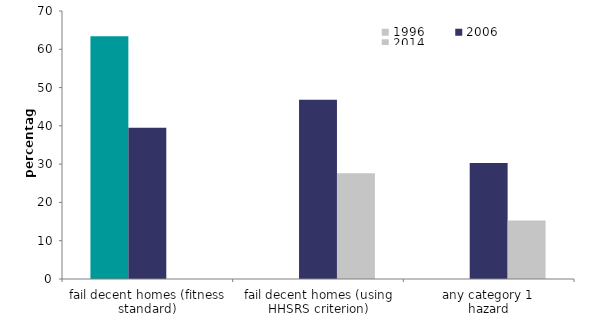
| Category | 1996 | 2006 | 2014 |
|---|---|---|---|
| fail decent homes (fitness standard) | 63.397 | 39.511 | 0 |
| fail decent homes (using HHSRS criterion) | 0 | 46.803 | 27.632 |
| any category 1 
hazard | 0 | 30.282 | 15.304 |